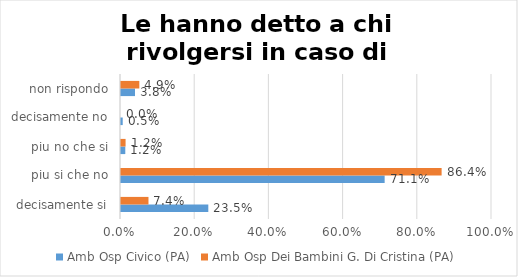
| Category | Amb Osp Civico (PA) | Amb Osp Dei Bambini G. Di Cristina (PA) |
|---|---|---|
| decisamente si | 0.235 | 0.074 |
| piu si che no | 0.711 | 0.864 |
| piu no che si | 0.012 | 0.012 |
| decisamente no | 0.005 | 0 |
| non rispondo | 0.038 | 0.049 |